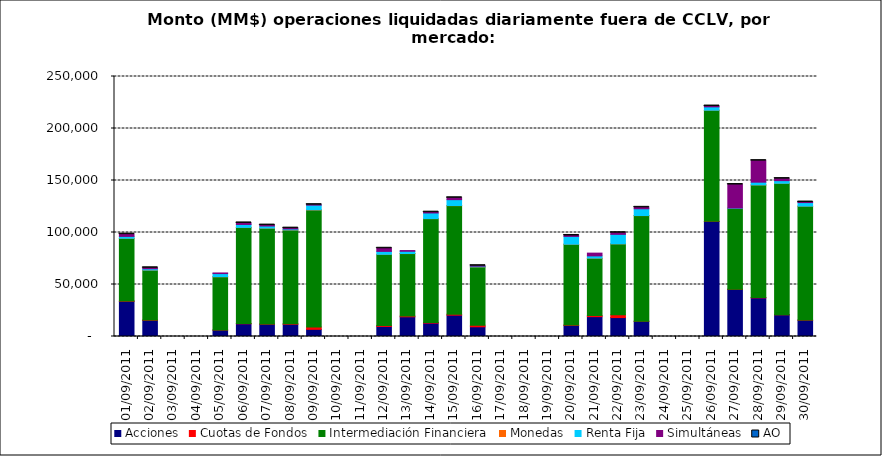
| Category | Acciones | Cuotas de Fondos | Intermediación Financiera | Monedas | Renta Fija | Simultáneas | AO |
|---|---|---|---|---|---|---|---|
| 01/09/2011 | 33837.581 | 370.775 | 60151.629 | 93.044 | 1785.497 | 2181.344 | 0.288 |
| 02/09/2011 | 15546.053 | 299.022 | 47928.428 | 122.205 | 1248.987 | 900.089 | 0.121 |
| 05/09/2011 | 6183.14 | 24.75 | 51231.526 | 73.029 | 2980.906 | 612.84 | 0 |
| 06/09/2011 | 12232.285 | 252.807 | 92288.56 | 134.418 | 2821.976 | 1456.025 | 0.414 |
| 07/09/2011 | 11800.618 | 138.701 | 92226.378 | 71.005 | 2004.345 | 863.986 | 0.213 |
| 08/09/2011 | 11763.986 | 576.697 | 89984.463 | 162.177 | 971.805 | 704.174 | 0.349 |
| 09/09/2011 | 6899.009 | 2223.454 | 112523.34 | 172.5 | 4499.886 | 417.195 | 0.108 |
| 12/09/2011 | 9688.893 | 813.768 | 68417.657 | 102.814 | 2811.632 | 2979.599 | 0.156 |
| 13/09/2011 | 18951.588 | 722.252 | 60035.975 | 110.863 | 2145.214 | 664.321 | 0 |
| 14/09/2011 | 12885.287 | 631.887 | 99829.743 | 20.466 | 5423.689 | 727.252 | 0.164 |
| 15/09/2011 | 20550.896 | 872.372 | 104390.672 | 113.233 | 5660.539 | 1780.557 | 0.038 |
| 16/09/2011 | 9338.678 | 1537.901 | 56033.264 | 81.288 | 622.506 | 445.245 | 0.051 |
| 20/09/2011 | 10653.417 | 478.659 | 77509.659 | 98.078 | 7510.634 | 882.828 | 0.063 |
| 21/09/2011 | 19081.559 | 1089.706 | 55138.077 | 80.668 | 2127.206 | 2649.398 | 0 |
| 22/09/2011 | 18204.115 | 2604.673 | 68269.156 | 29.545 | 9109.826 | 1561.712 | 0.228 |
| 23/09/2011 | 14630.376 | 22.318 | 101598.881 | 62.98 | 6500.568 | 1366.736 | 0.724 |
| 26/09/2011 | 110642.708 | 74.984 | 106841.628 | 22.008 | 3231.788 | 752.87 | 0.243 |
| 27/09/2011 | 45369.26 | 63.704 | 77702.81 | 63.237 | 343.017 | 22557.994 | 0.065 |
| 28/09/2011 | 37155.49 | 403.69 | 108169.925 | 54.96 | 2598.713 | 20694.15 | 0.027 |
| 29/09/2011 | 20884.25 | 99.129 | 126329.714 | 15.809 | 2542.43 | 1923.031 | 0.028 |
| 30/09/2011 | 15685.455 | 113.623 | 109539.457 | 21.475 | 3414.759 | 483.848 | 0.247 |